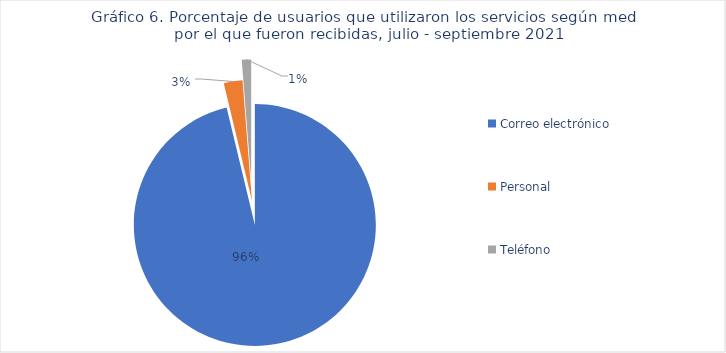
| Category | Cantidad |
|---|---|
| Correo electrónico | 77 |
| Personal | 2 |
| Teléfono | 1 |